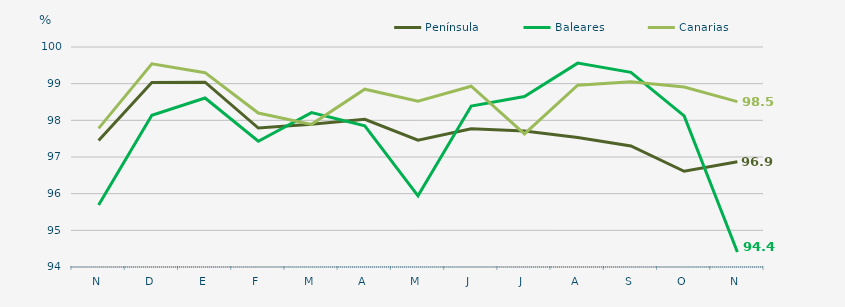
| Category | Península | Baleares | Canarias |
|---|---|---|---|
| N | 97.45 | 95.69 | 97.78 |
| D | 99.03 | 98.14 | 99.54 |
| E | 99.04 | 98.61 | 99.3 |
| F | 97.79 | 97.43 | 98.2 |
| M | 97.89 | 98.21 | 97.89 |
| A | 98.03 | 97.85 | 98.85 |
| M | 97.46 | 95.94 | 98.52 |
| J | 97.77 | 98.39 | 98.93 |
| J | 97.71 | 98.65 | 97.63 |
| A | 97.53 | 99.56 | 98.96 |
| S | 97.3 | 99.31 | 99.05 |
| O | 96.61 | 98.12 | 98.91 |
| N | 96.87 | 94.41 | 98.51 |